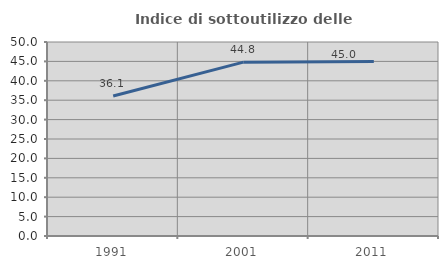
| Category | Indice di sottoutilizzo delle abitazioni  |
|---|---|
| 1991.0 | 36.079 |
| 2001.0 | 44.803 |
| 2011.0 | 44.967 |